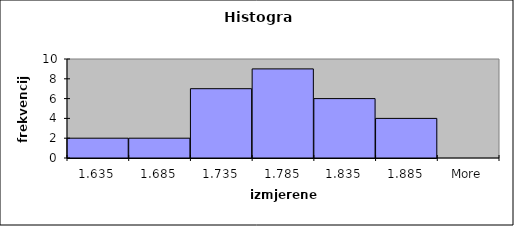
| Category | Frequency |
|---|---|
| 1,635 | 2 |
| 1,685 | 2 |
| 1,735 | 7 |
| 1,785 | 9 |
| 1,835 | 6 |
| 1,885 | 4 |
| More | 0 |